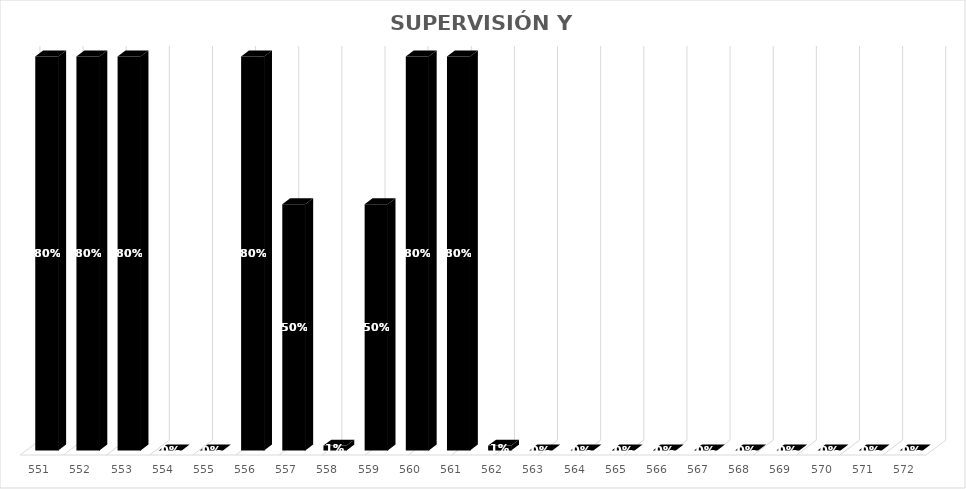
| Category | % Avance |
|---|---|
| 551.0 | 0.8 |
| 552.0 | 0.8 |
| 553.0 | 0.8 |
| 554.0 | 0 |
| 555.0 | 0 |
| 556.0 | 0.8 |
| 557.0 | 0.5 |
| 558.0 | 0.01 |
| 559.0 | 0.5 |
| 560.0 | 0.8 |
| 561.0 | 0.8 |
| 562.0 | 0.01 |
| 563.0 | 0 |
| 564.0 | 0 |
| 565.0 | 0 |
| 566.0 | 0 |
| 567.0 | 0 |
| 568.0 | 0 |
| 569.0 | 0 |
| 570.0 | 0 |
| 571.0 | 0 |
| 572.0 | 0 |